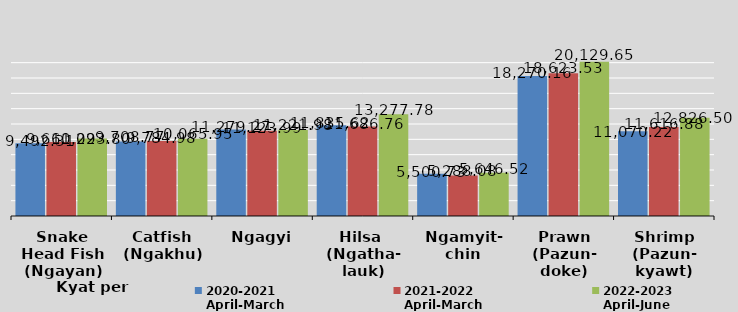
| Category | 2020-2021
April-March
 | 2021-2022
April-March
 | 2022-2023
April-June

 |
|---|---|---|---|
| Snake Head Fish
(Ngayan) | 9492.306 | 9661.223 | 10093.802 |
| Catfish
(Ngakhu) | 9708.767 | 9784.982 | 10065.954 |
| Ngagyi | 11279.267 | 11123.993 | 11221.978 |
| Hilsa 
(Ngatha-
lauk) | 11835.621 | 11686.765 | 13277.778 |
| Ngamyit-
chin | 5500.725 | 5288.08 | 5646.522 |
| Prawn
(Pazun-
doke) | 18270.157 | 18623.534 | 20129.648 |
| Shrimp
(Pazun-
kyawt) | 11070.221 | 11616.88 | 12826.496 |